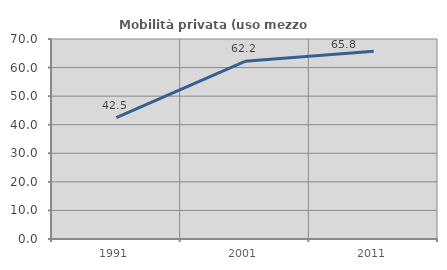
| Category | Mobilità privata (uso mezzo privato) |
|---|---|
| 1991.0 | 42.477 |
| 2001.0 | 62.195 |
| 2011.0 | 65.753 |